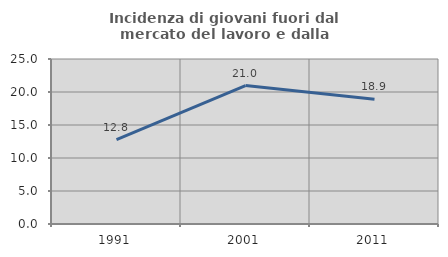
| Category | Incidenza di giovani fuori dal mercato del lavoro e dalla formazione  |
|---|---|
| 1991.0 | 12.774 |
| 2001.0 | 20.98 |
| 2011.0 | 18.891 |